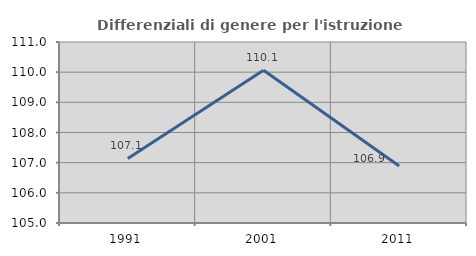
| Category | Differenziali di genere per l'istruzione superiore |
|---|---|
| 1991.0 | 107.14 |
| 2001.0 | 110.065 |
| 2011.0 | 106.893 |